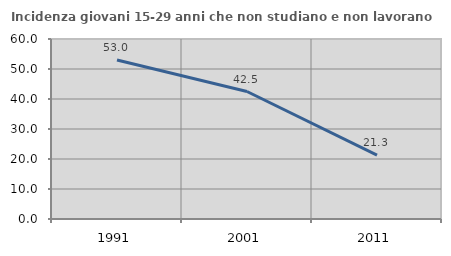
| Category | Incidenza giovani 15-29 anni che non studiano e non lavorano  |
|---|---|
| 1991.0 | 53.006 |
| 2001.0 | 42.5 |
| 2011.0 | 21.311 |